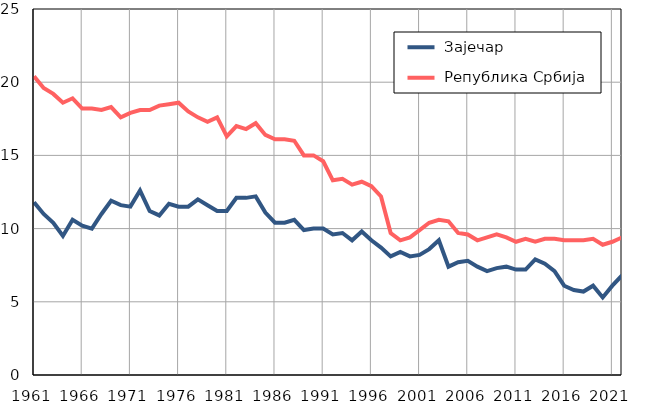
| Category |  Зајечар |  Република Србија |
|---|---|---|
| 1961.0 | 11.8 | 20.4 |
| 1962.0 | 11 | 19.6 |
| 1963.0 | 10.4 | 19.2 |
| 1964.0 | 9.5 | 18.6 |
| 1965.0 | 10.6 | 18.9 |
| 1966.0 | 10.2 | 18.2 |
| 1967.0 | 10 | 18.2 |
| 1968.0 | 11 | 18.1 |
| 1969.0 | 11.9 | 18.3 |
| 1970.0 | 11.6 | 17.6 |
| 1971.0 | 11.5 | 17.9 |
| 1972.0 | 12.6 | 18.1 |
| 1973.0 | 11.2 | 18.1 |
| 1974.0 | 10.9 | 18.4 |
| 1975.0 | 11.7 | 18.5 |
| 1976.0 | 11.5 | 18.6 |
| 1977.0 | 11.5 | 18 |
| 1978.0 | 12 | 17.6 |
| 1979.0 | 11.6 | 17.3 |
| 1980.0 | 11.2 | 17.6 |
| 1981.0 | 11.2 | 16.3 |
| 1982.0 | 12.1 | 17 |
| 1983.0 | 12.1 | 16.8 |
| 1984.0 | 12.2 | 17.2 |
| 1985.0 | 11.1 | 16.4 |
| 1986.0 | 10.4 | 16.1 |
| 1987.0 | 10.4 | 16.1 |
| 1988.0 | 10.6 | 16 |
| 1989.0 | 9.9 | 15 |
| 1990.0 | 10 | 15 |
| 1991.0 | 10 | 14.6 |
| 1992.0 | 9.6 | 13.3 |
| 1993.0 | 9.7 | 13.4 |
| 1994.0 | 9.2 | 13 |
| 1995.0 | 9.8 | 13.2 |
| 1996.0 | 9.2 | 12.9 |
| 1997.0 | 8.7 | 12.2 |
| 1998.0 | 8.1 | 9.7 |
| 1999.0 | 8.4 | 9.2 |
| 2000.0 | 8.1 | 9.4 |
| 2001.0 | 8.2 | 9.9 |
| 2002.0 | 8.6 | 10.4 |
| 2003.0 | 9.2 | 10.6 |
| 2004.0 | 7.4 | 10.5 |
| 2005.0 | 7.7 | 9.7 |
| 2006.0 | 7.8 | 9.6 |
| 2007.0 | 7.4 | 9.2 |
| 2008.0 | 7.1 | 9.4 |
| 2009.0 | 7.3 | 9.6 |
| 2010.0 | 7.4 | 9.4 |
| 2011.0 | 7.2 | 9.1 |
| 2012.0 | 7.2 | 9.3 |
| 2013.0 | 7.9 | 9.1 |
| 2014.0 | 7.6 | 9.3 |
| 2015.0 | 7.1 | 9.3 |
| 2016.0 | 6.1 | 9.2 |
| 2017.0 | 5.8 | 9.2 |
| 2018.0 | 5.7 | 9.2 |
| 2019.0 | 6.1 | 9.3 |
| 2020.0 | 5.3 | 8.9 |
| 2021.0 | 6.1 | 9.1 |
| 2022.0 | 6.8 | 9.4 |